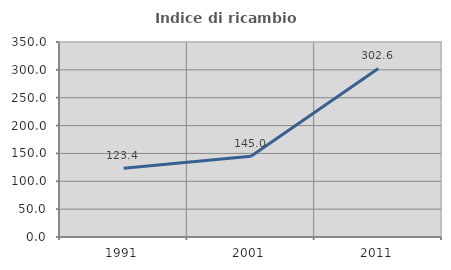
| Category | Indice di ricambio occupazionale  |
|---|---|
| 1991.0 | 123.361 |
| 2001.0 | 145.05 |
| 2011.0 | 302.632 |